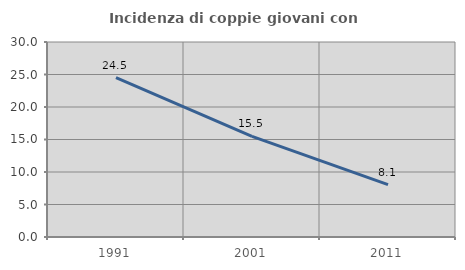
| Category | Incidenza di coppie giovani con figli |
|---|---|
| 1991.0 | 24.535 |
| 2001.0 | 15.489 |
| 2011.0 | 8.056 |